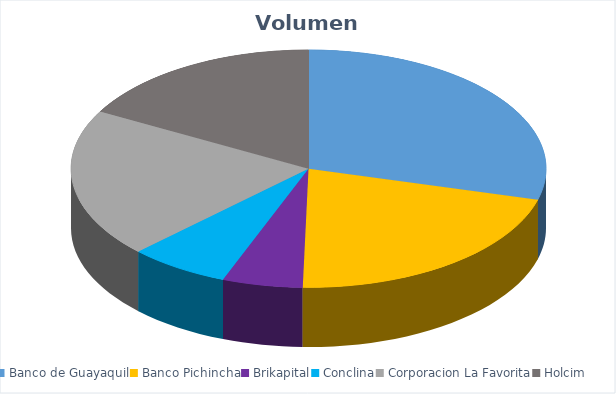
| Category | VOLUMEN ($USD) |
|---|---|
| Banco de Guayaquil | 64030.2 |
| Banco Pichincha | 46440 |
| Brikapital | 12000 |
| Conclina | 15000 |
| Corporacion La Favorita | 44468.34 |
| Holcim | 37310 |